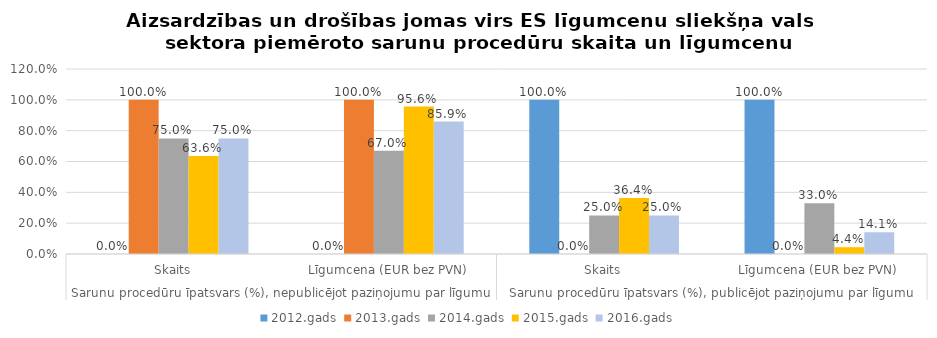
| Category | 2012.gads | 2013.gads | 2014.gads | 2015.gads | 2016.gads |
|---|---|---|---|---|---|
| 0 | 0 | 1 | 0.75 | 0.636 | 0.75 |
| 1 | 0 | 1 | 0.67 | 0.956 | 0.859 |
| 2 | 1 | 0 | 0.25 | 0.364 | 0.25 |
| 3 | 1 | 0 | 0.33 | 0.044 | 0.141 |